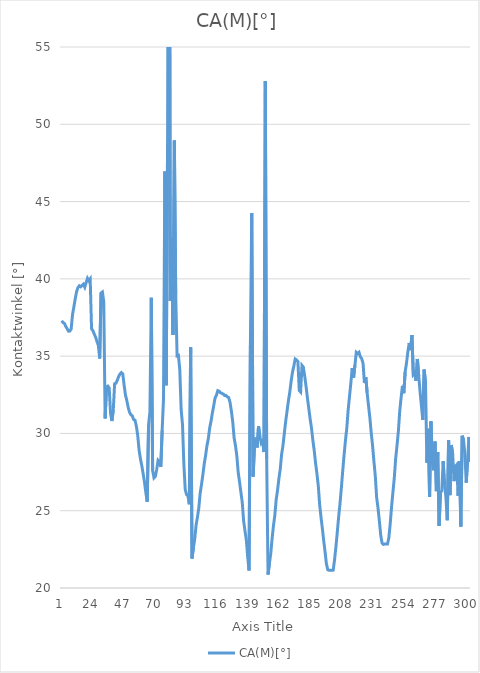
| Category | CA(M)[°] |
|---|---|
| 0 | 37.29 |
| 1 | 37.174 |
| 2 | 37.121 |
| 3 | 36.928 |
| 4 | 36.776 |
| 5 | 36.617 |
| 6 | 36.62 |
| 7 | 36.764 |
| 8 | 37.695 |
| 9 | 38.194 |
| 10 | 38.729 |
| 11 | 39.177 |
| 12 | 39.434 |
| 13 | 39.55 |
| 14 | 39.488 |
| 15 | 39.579 |
| 16 | 39.657 |
| 17 | 39.462 |
| 18 | 39.752 |
| 19 | 40.037 |
| 20 | 39.877 |
| 21 | 40.001 |
| 22 | 36.777 |
| 23 | 36.645 |
| 24 | 36.429 |
| 25 | 36.227 |
| 26 | 35.947 |
| 27 | 35.697 |
| 28 | 34.848 |
| 29 | 39.088 |
| 30 | 39.152 |
| 31 | 38.522 |
| 32 | 30.972 |
| 33 | 33.003 |
| 34 | 33.062 |
| 35 | 32.931 |
| 36 | 31.292 |
| 37 | 30.802 |
| 38 | 31.508 |
| 39 | 33.215 |
| 40 | 33.249 |
| 41 | 33.449 |
| 42 | 33.691 |
| 43 | 33.851 |
| 44 | 33.935 |
| 45 | 33.855 |
| 46 | 33.114 |
| 47 | 32.474 |
| 48 | 32.122 |
| 49 | 31.674 |
| 50 | 31.37 |
| 51 | 31.205 |
| 52 | 31.142 |
| 53 | 30.899 |
| 54 | 30.857 |
| 55 | 30.476 |
| 56 | 29.879 |
| 57 | 28.939 |
| 58 | 28.367 |
| 59 | 27.917 |
| 60 | 27.399 |
| 61 | 26.853 |
| 62 | 26.169 |
| 63 | 25.58 |
| 64 | 30.549 |
| 65 | 31.398 |
| 66 | 38.775 |
| 67 | 27.593 |
| 68 | 27.127 |
| 69 | 27.213 |
| 70 | 27.665 |
| 71 | 28.259 |
| 72 | 28.165 |
| 73 | 27.838 |
| 74 | 30.185 |
| 75 | 32.22 |
| 76 | 46.952 |
| 77 | 33.114 |
| 78 | 48.649 |
| 79 | 87.546 |
| 80 | 38.566 |
| 81 | 42.682 |
| 82 | 36.37 |
| 83 | 48.951 |
| 84 | 38.94 |
| 85 | 35.017 |
| 86 | 35.053 |
| 87 | 34.115 |
| 88 | 31.532 |
| 89 | 30.564 |
| 90 | 28.004 |
| 91 | 26.372 |
| 92 | 26.034 |
| 93 | 25.97 |
| 94 | 25.423 |
| 95 | 35.576 |
| 96 | 21.915 |
| 97 | 22.589 |
| 98 | 23.178 |
| 99 | 24.067 |
| 100 | 24.582 |
| 101 | 25.168 |
| 102 | 26.131 |
| 103 | 26.7 |
| 104 | 27.33 |
| 105 | 28.035 |
| 106 | 28.565 |
| 107 | 29.207 |
| 108 | 29.646 |
| 109 | 30.345 |
| 110 | 30.786 |
| 111 | 31.323 |
| 112 | 31.799 |
| 113 | 32.302 |
| 114 | 32.473 |
| 115 | 32.766 |
| 116 | 32.732 |
| 117 | 32.632 |
| 118 | 32.59 |
| 119 | 32.551 |
| 120 | 32.454 |
| 121 | 32.463 |
| 122 | 32.367 |
| 123 | 32.324 |
| 124 | 32.018 |
| 125 | 31.447 |
| 126 | 30.759 |
| 127 | 29.719 |
| 128 | 29.223 |
| 129 | 28.556 |
| 130 | 27.503 |
| 131 | 26.868 |
| 132 | 26.203 |
| 133 | 25.55 |
| 134 | 24.36 |
| 135 | 23.709 |
| 136 | 23.119 |
| 137 | 22.028 |
| 138 | 21.138 |
| 139 | 35.696 |
| 140 | 44.254 |
| 141 | 27.211 |
| 142 | 29.148 |
| 143 | 29.732 |
| 144 | 29.096 |
| 145 | 30.468 |
| 146 | 29.796 |
| 147 | 29.377 |
| 148 | 29.512 |
| 149 | 28.792 |
| 150 | 52.805 |
| 151 | 28.363 |
| 152 | 20.871 |
| 153 | 21.58 |
| 154 | 22.217 |
| 155 | 23.212 |
| 156 | 24.039 |
| 157 | 24.7 |
| 158 | 25.722 |
| 159 | 26.324 |
| 160 | 27.076 |
| 161 | 27.693 |
| 162 | 28.652 |
| 163 | 29.211 |
| 164 | 30.009 |
| 165 | 30.777 |
| 166 | 31.445 |
| 167 | 32.107 |
| 168 | 32.653 |
| 169 | 33.368 |
| 170 | 33.958 |
| 171 | 34.357 |
| 172 | 34.815 |
| 173 | 34.755 |
| 174 | 34.648 |
| 175 | 32.777 |
| 176 | 32.678 |
| 177 | 34.401 |
| 178 | 34.29 |
| 179 | 33.721 |
| 180 | 33.041 |
| 181 | 32.304 |
| 182 | 31.63 |
| 183 | 30.943 |
| 184 | 30.355 |
| 185 | 29.569 |
| 186 | 28.908 |
| 187 | 28.09 |
| 188 | 27.408 |
| 189 | 26.631 |
| 190 | 25.419 |
| 191 | 24.589 |
| 192 | 23.864 |
| 193 | 23.064 |
| 194 | 22.342 |
| 195 | 21.562 |
| 196 | 21.182 |
| 197 | 21.148 |
| 198 | 21.14 |
| 199 | 21.141 |
| 200 | 21.155 |
| 201 | 21.825 |
| 202 | 22.657 |
| 203 | 23.602 |
| 204 | 24.595 |
| 205 | 25.451 |
| 206 | 26.463 |
| 207 | 27.568 |
| 208 | 28.588 |
| 209 | 29.528 |
| 210 | 30.326 |
| 211 | 31.508 |
| 212 | 32.386 |
| 213 | 33.261 |
| 214 | 34.226 |
| 215 | 33.607 |
| 216 | 34.416 |
| 217 | 35.248 |
| 218 | 35.174 |
| 219 | 35.249 |
| 220 | 34.96 |
| 221 | 34.839 |
| 222 | 34.525 |
| 223 | 33.274 |
| 224 | 33.643 |
| 225 | 32.621 |
| 226 | 31.806 |
| 227 | 31.026 |
| 228 | 30.042 |
| 229 | 29.206 |
| 230 | 28.195 |
| 231 | 27.252 |
| 232 | 25.858 |
| 233 | 25.178 |
| 234 | 24.333 |
| 235 | 23.416 |
| 236 | 22.906 |
| 237 | 22.821 |
| 238 | 22.847 |
| 239 | 22.846 |
| 240 | 22.846 |
| 241 | 23.256 |
| 242 | 24.161 |
| 243 | 25.27 |
| 244 | 26.211 |
| 245 | 27.124 |
| 246 | 28.358 |
| 247 | 29.222 |
| 248 | 30.125 |
| 249 | 31.438 |
| 250 | 32.3 |
| 251 | 33.08 |
| 252 | 32.601 |
| 253 | 33.982 |
| 254 | 34.548 |
| 255 | 35.296 |
| 256 | 35.848 |
| 257 | 35.389 |
| 258 | 36.357 |
| 259 | 33.81 |
| 260 | 33.919 |
| 261 | 33.409 |
| 262 | 34.817 |
| 263 | 33.712 |
| 264 | 32.689 |
| 265 | 31.768 |
| 266 | 30.88 |
| 267 | 34.126 |
| 268 | 33.294 |
| 269 | 28.11 |
| 270 | 30.302 |
| 271 | 25.902 |
| 272 | 30.781 |
| 273 | 28.175 |
| 274 | 27.616 |
| 275 | 29.472 |
| 276 | 26.265 |
| 277 | 28.796 |
| 278 | 24.019 |
| 279 | 26.148 |
| 280 | 26.3 |
| 281 | 28.204 |
| 282 | 26.651 |
| 283 | 25.912 |
| 284 | 24.383 |
| 285 | 29.553 |
| 286 | 26.011 |
| 287 | 29.254 |
| 288 | 28.688 |
| 289 | 26.914 |
| 290 | 27.876 |
| 291 | 27.977 |
| 292 | 25.964 |
| 293 | 28.216 |
| 294 | 23.973 |
| 295 | 29.852 |
| 296 | 29.581 |
| 297 | 28.641 |
| 298 | 26.816 |
| 299 | 28.287 |
| 300 | 29.774 |
| 301 | 28.157 |